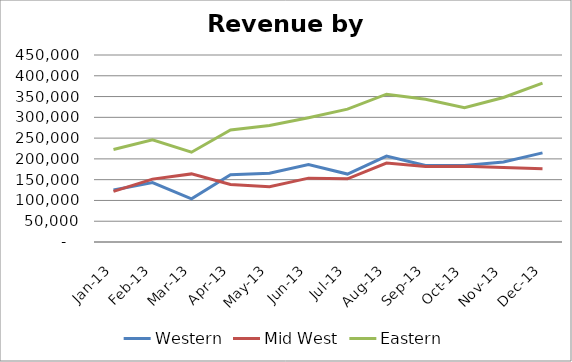
| Category | Western | Mid West | Eastern |
|---|---|---|---|
| 2013-01-31 | 125369 | 121946 | 222447 |
| 2013-02-28 | 142982 | 151360 | 245732 |
| 2013-03-31 | 103755 | 163887 | 216128 |
| 2013-04-30 | 162118 | 138212 | 269451 |
| 2013-05-31 | 165415 | 132854 | 280337 |
| 2013-06-30 | 186607 | 153655 | 298912 |
| 2013-07-31 | 163484 | 151993 | 319651 |
| 2013-08-31 | 206763 | 190060 | 355704 |
| 2013-09-30 | 184334 | 181573 | 343302 |
| 2013-10-31 | 183954 | 182347 | 323091 |
| 2013-11-30 | 192606 | 179126 | 347683 |
| 2013-12-31 | 214558 | 176462 | 382234 |